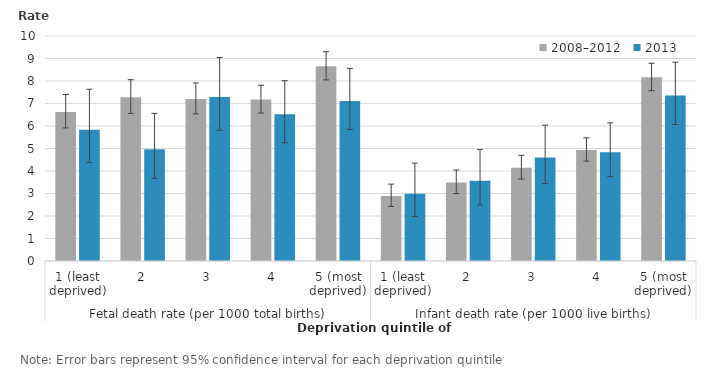
| Category | 2008–2012 | 2013 |
|---|---|---|
| 0 | 6.626 | 5.837 |
| 1 | 7.279 | 4.963 |
| 2 | 7.199 | 7.293 |
| 3 | 7.173 | 6.525 |
| 4 | 8.657 | 7.11 |
| 5 | 2.889 | 2.991 |
| 6 | 3.489 | 3.562 |
| 7 | 4.146 | 4.603 |
| 8 | 4.935 | 4.836 |
| 9 | 8.162 | 7.355 |